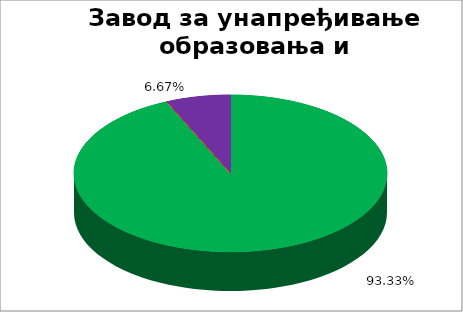
| Category | Завод за унапређивање образовања и васпитања  |
|---|---|
| 0 | 0.933 |
| 1 | 0 |
| 2 | 0 |
| 3 | 0 |
| 4 | 0.067 |